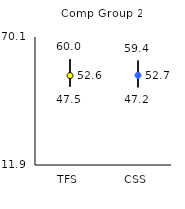
| Category | 25th | 75th | Mean |
|---|---|---|---|
| TFS | 47.5 | 60 | 52.56 |
| CSS | 47.2 | 59.4 | 52.67 |